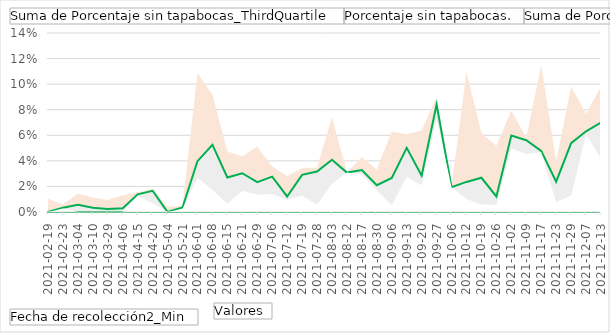
| Category | Suma de Porcentaje sin tapabocas_ThirdQuartile | Porcentaje sin tapabocas. | Suma de Porcentaje sin tapabocas_FirstQuartile |
|---|---|---|---|
| 2021-02-19 | 0.01 | 0 | 0 |
| 2021-02-23 | 0.006 | 0.003 | 0.003 |
| 2021-03-04 | 0.014 | 0.006 | 0 |
| 2021-03-10 | 0.011 | 0.003 | 0 |
| 2021-03-29 | 0.009 | 0.002 | 0 |
| 2021-04-06 | 0.013 | 0.003 | 0 |
| 2021-04-15 | 0.015 | 0.014 | 0.012 |
| 2021-04-20 | 0.018 | 0.017 | 0.007 |
| 2021-05-04 | 0.004 | 0 | 0 |
| 2021-05-21 | 0.005 | 0.004 | 0.002 |
| 2021-06-01 | 0.109 | 0.04 | 0.027 |
| 2021-06-08 | 0.092 | 0.053 | 0.017 |
| 2021-06-15 | 0.047 | 0.027 | 0.006 |
| 2021-06-21 | 0.043 | 0.03 | 0.017 |
| 2021-06-29 | 0.051 | 0.023 | 0.014 |
| 2021-07-06 | 0.036 | 0.028 | 0.014 |
| 2021-07-12 | 0.028 | 0.012 | 0.01 |
| 2021-07-19 | 0.034 | 0.029 | 0.013 |
| 2021-07-28 | 0.035 | 0.032 | 0.006 |
| 2021-08-03 | 0.074 | 0.041 | 0.022 |
| 2021-08-12 | 0.031 | 0.031 | 0.031 |
| 2021-08-17 | 0.043 | 0.033 | 0.029 |
| 2021-08-30 | 0.033 | 0.021 | 0.017 |
| 2021-09-06 | 0.063 | 0.027 | 0.005 |
| 2021-09-13 | 0.061 | 0.05 | 0.028 |
| 2021-09-20 | 0.064 | 0.028 | 0.021 |
| 2021-09-27 | 0.09 | 0.084 | 0.073 |
| 2021-10-06 | 0.019 | 0.019 | 0.019 |
| 2021-10-12 | 0.11 | 0.024 | 0.01 |
| 2021-10-19 | 0.062 | 0.027 | 0.006 |
| 2021-10-26 | 0.052 | 0.012 | 0.006 |
| 2021-11-02 | 0.079 | 0.06 | 0.05 |
| 2021-11-09 | 0.058 | 0.056 | 0.045 |
| 2021-11-17 | 0.115 | 0.048 | 0.047 |
| 2021-11-23 | 0.04 | 0.024 | 0.008 |
| 2021-11-29 | 0.098 | 0.054 | 0.013 |
| 2021-12-07 | 0.077 | 0.063 | 0.061 |
| 2021-12-13 | 0.098 | 0.07 | 0.042 |